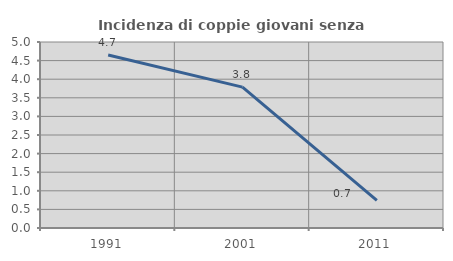
| Category | Incidenza di coppie giovani senza figli |
|---|---|
| 1991.0 | 4.651 |
| 2001.0 | 3.788 |
| 2011.0 | 0.741 |